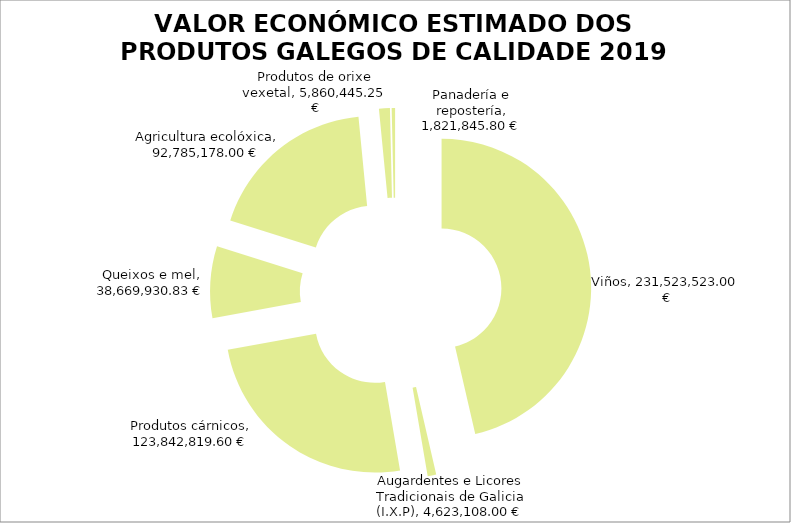
| Category | VALOR ECONÓMICO ESTIMADO DOS PRODUTOS GALEGOS DE CALIDADE 2019 |
|---|---|
| Viños | 231523523 |
| Augardentes e Licores Tradicionais de Galicia (I.X.P) | 4623108 |
| Produtos cárnicos | 123842819.6 |
| Queixos e mel | 38669930.83 |
| Agricultura ecolóxica | 92785178 |
| Produtos de orixe vexetal | 5860445.25 |
| Panadería e repostería | 1821845.8 |